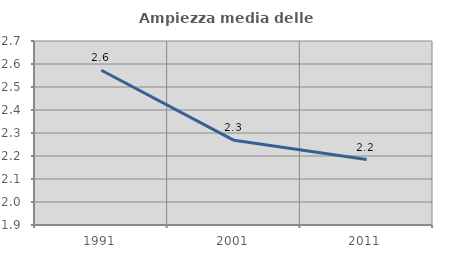
| Category | Ampiezza media delle famiglie |
|---|---|
| 1991.0 | 2.573 |
| 2001.0 | 2.268 |
| 2011.0 | 2.184 |